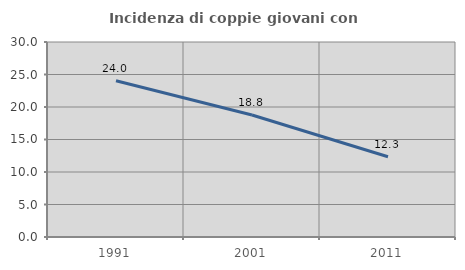
| Category | Incidenza di coppie giovani con figli |
|---|---|
| 1991.0 | 24.036 |
| 2001.0 | 18.761 |
| 2011.0 | 12.344 |